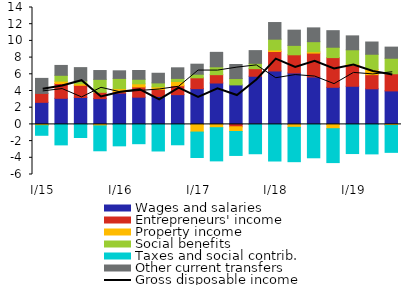
| Category | Wages and salaries | Entrepreneurs' income | Property income | Social benefits  | Taxes and social contrib. | Other current transfers |
|---|---|---|---|---|---|---|
|  I/15 | 2.644 | 1.067 | -0.089 | -0.068 | -1.147 | 1.798 |
| II | 3.127 | 1.772 | 0.282 | 0.699 | -2.453 | 1.182 |
| III | 3.227 | 1.458 | 0.182 | 0.346 | -1.568 | 1.587 |
| IV | 3.087 | 0.757 | -0.172 | 1.551 | -2.987 | 1.055 |
|  I/16 | 3.741 | 0.163 | 0.381 | 1.222 | -2.567 | 0.911 |
| II | 3.262 | 1.228 | 0.371 | 0.546 | -2.311 | 1.047 |
| III | 3.352 | 0.842 | 0.302 | 0.473 | -3.184 | 1.156 |
| IV | 3.566 | 1.066 | 0.51 | 0.365 | -2.44 | 1.271 |
|  I/17 | 4.283 | 1.297 | -0.919 | 0.427 | -3.047 | 1.205 |
| II | 4.957 | 0.999 | -0.395 | 0.943 | -3.973 | 1.731 |
| III | 4.729 | -0.286 | -0.562 | 0.761 | -2.87 | 1.682 |
| IV | 5.766 | 0.908 | -0.008 | 0.636 | -3.506 | 1.526 |
|  I/18 | 6.399 | 2.328 | 0.185 | 1.293 | -4.385 | 1.994 |
| II | 6.161 | 2.175 | -0.35 | 1.128 | -4.114 | 1.823 |
| III | 5.68 | 2.86 | 0.156 | 1.213 | -3.998 | 1.651 |
| IV | 4.444 | 3.556 | -0.518 | 1.243 | -4.056 | 1.983 |
|  I/19 | 4.567 | 2.487 | 0.175 | 1.707 | -3.491 | 1.666 |
| II | 4.262 | 1.698 | 0.622 | 1.82 | -3.532 | 1.465 |
| III | 4.011 | 2.052 | -0.12 | 1.858 | -3.227 | 1.334 |